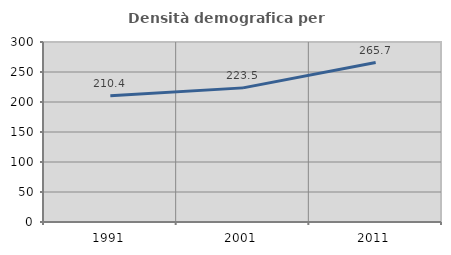
| Category | Densità demografica |
|---|---|
| 1991.0 | 210.364 |
| 2001.0 | 223.542 |
| 2011.0 | 265.708 |